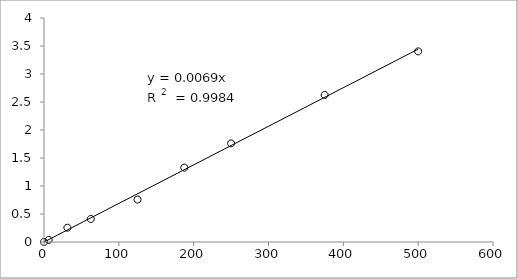
| Category | Series 0 |
|---|---|
| 500.0 | 3.404 |
| 375.0 | 2.626 |
| 250.0 | 1.761 |
| 187.5 | 1.328 |
| 125.0 | 0.758 |
| 62.5 | 0.411 |
| 31.25 | 0.255 |
| 6.25 | 0.037 |
| 0.0 | 0 |